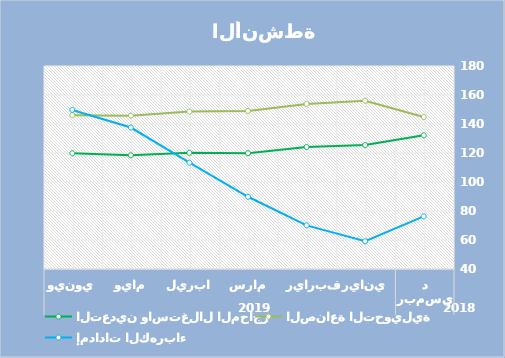
| Category | التعدين واستغلال المحاجر | الصناعة التحويلية | إمدادات الكهرباء |
|---|---|---|---|
| 0 | 132.18 | 144.85 | 76.31 |
| 1 | 125.45 | 155.98 | 59.15 |
| 2 | 124.14 | 153.87 | 70.1 |
| 3 | 119.87 | 148.98 | 89.82 |
| 4 | 120.11 | 148.54 | 113.29 |
| 5 | 118.43 | 145.76 | 137.57 |
| 6 | 119.81 | 146.05 | 149.7 |